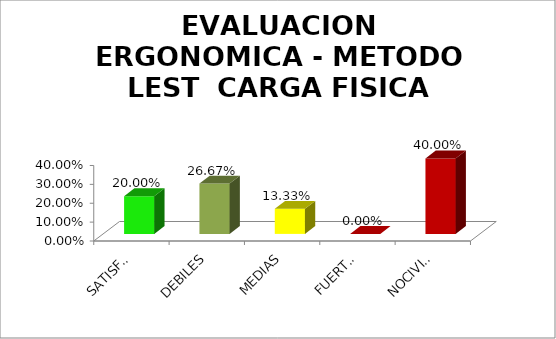
| Category | EVALUACION ERGONOMICA - METODO LEST  |
|---|---|
| SATISFACTORIO | 0.2 |
| DEBILES | 0.267 |
| MEDIAS | 0.133 |
| FUERTES | 0 |
| NOCIVIDAD | 0.4 |